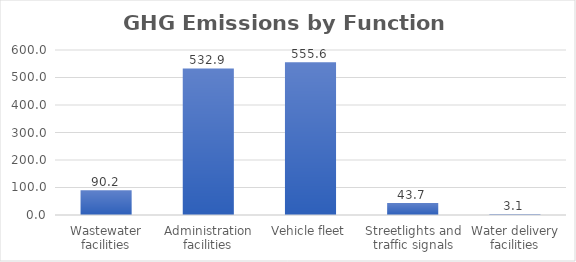
| Category | GHG Emissions (tons) |
|---|---|
| Wastewater facilities | 90.204 |
| Administration facilities | 532.905 |
| Vehicle fleet | 555.608 |
| Streetlights and traffic signals | 43.744 |
| Water delivery facilities | 3.138 |